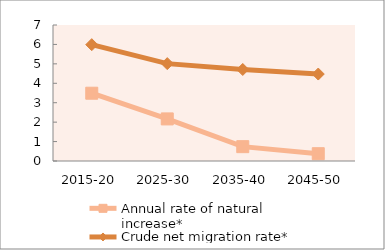
| Category | Annual rate of natural increase* | Crude net migration rate* |
|---|---|---|
| 2015-20 | 3.489 | 5.988 |
| 2025-30 | 2.166 | 5.012 |
| 2035-40 | 0.738 | 4.71 |
| 2045-50 | 0.376 | 4.476 |